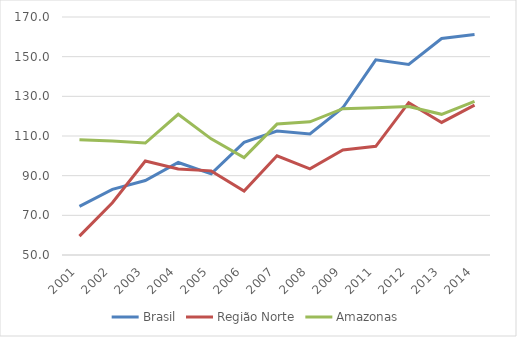
| Category | Brasil | Região Norte | Amazonas |
|---|---|---|---|
| 2001.0 | 74.53 | 59.521 | 108.097 |
| 2002.0 | 83.092 | 76.341 | 107.474 |
| 2003.0 | 87.545 | 97.373 | 106.453 |
| 2004.0 | 96.651 | 93.349 | 120.946 |
| 2005.0 | 90.93 | 92.425 | 108.571 |
| 2006.0 | 106.812 | 82.229 | 99.134 |
| 2007.0 | 112.466 | 100.028 | 116.012 |
| 2008.0 | 111.013 | 93.466 | 117.171 |
| 2009.0 | 124.225 | 102.915 | 123.784 |
| 2011.0 | 148.383 | 104.804 | 124.235 |
| 2012.0 | 146.057 | 126.788 | 124.883 |
| 2013.0 | 159.169 | 116.842 | 120.934 |
| 2014.0 | 161.157 | 125.537 | 127.461 |